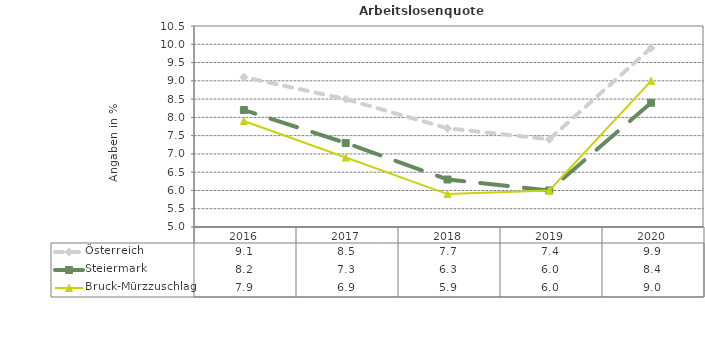
| Category | Österreich | Steiermark | Bruck-Mürzzuschlag |
|---|---|---|---|
| 2020.0 | 9.9 | 8.4 | 9 |
| 2019.0 | 7.4 | 6 | 6 |
| 2018.0 | 7.7 | 6.3 | 5.9 |
| 2017.0 | 8.5 | 7.3 | 6.9 |
| 2016.0 | 9.1 | 8.2 | 7.9 |